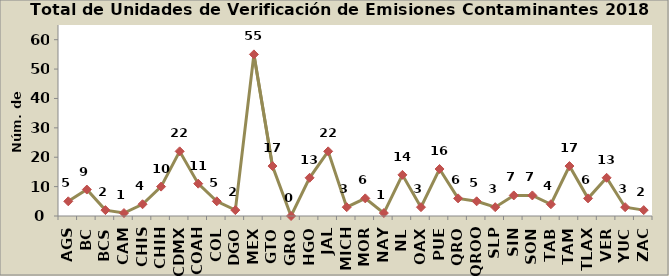
| Category | Total |
|---|---|
| AGS | 5 |
| BC | 9 |
| BCS | 2 |
| CAM | 1 |
| CHIS | 4 |
| CHIH | 10 |
| CDMX | 22 |
| COAH | 11 |
| COL | 5 |
| DGO | 2 |
| MEX | 55 |
| GTO | 17 |
| GRO | 0 |
| HGO | 13 |
| JAL | 22 |
| MICH | 3 |
| MOR | 6 |
| NAY | 1 |
| NL | 14 |
| OAX | 3 |
| PUE | 16 |
| QRO | 6 |
| QROO | 5 |
| SLP | 3 |
| SIN | 7 |
| SON | 7 |
| TAB | 4 |
| TAM | 17 |
| TLAX | 6 |
| VER | 13 |
| YUC | 3 |
| ZAC | 2 |